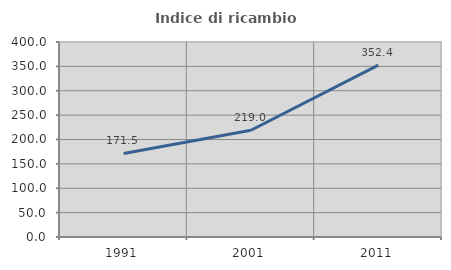
| Category | Indice di ricambio occupazionale  |
|---|---|
| 1991.0 | 171.452 |
| 2001.0 | 218.984 |
| 2011.0 | 352.43 |